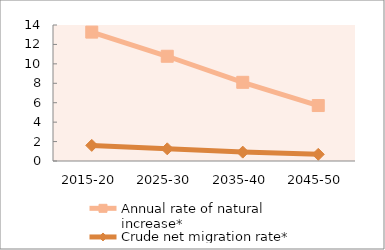
| Category | Annual rate of natural increase* | Crude net migration rate* |
|---|---|---|
| 2015-20 | 13.268 | 1.607 |
| 2025-30 | 10.783 | 1.253 |
| 2035-40 | 8.1 | 0.914 |
| 2045-50 | 5.71 | 0.686 |